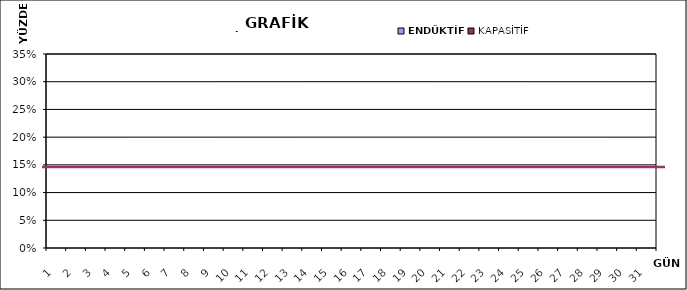
| Category | ENDÜKTİF | KAPASİTİF |
|---|---|---|
| 1.0 | 0 | 0 |
| 2.0 | 0 | 0 |
| 3.0 | 0 | 0 |
| 4.0 | 0 | 0 |
| 5.0 | 0 | 0 |
| 6.0 | 0 | 0 |
| 7.0 | 0 | 0 |
| 8.0 | 0 | 0 |
| 9.0 | 0 | 0 |
| 10.0 | 0 | 0 |
| 11.0 | 0 | 0 |
| 12.0 | 0 | 0 |
| 13.0 | 0 | 0 |
| 14.0 | 0 | 0 |
| 15.0 | 0 | 0 |
| 16.0 | 0 | 0 |
| 17.0 | 0 | 0 |
| 18.0 | 0 | 0 |
| 19.0 | 0 | 0 |
| 20.0 | 0 | 0 |
| 21.0 | 0 | 0 |
| 22.0 | 0 | 0 |
| 23.0 | 0 | 0 |
| 24.0 | 0 | 0 |
| 25.0 | 0 | 0 |
| 26.0 | 0 | 0 |
| 27.0 | 0 | 0 |
| 28.0 | 0 | 0 |
| 29.0 | 0 | 0 |
| 30.0 | 0 | 0 |
| 31.0 | 0 | 0 |